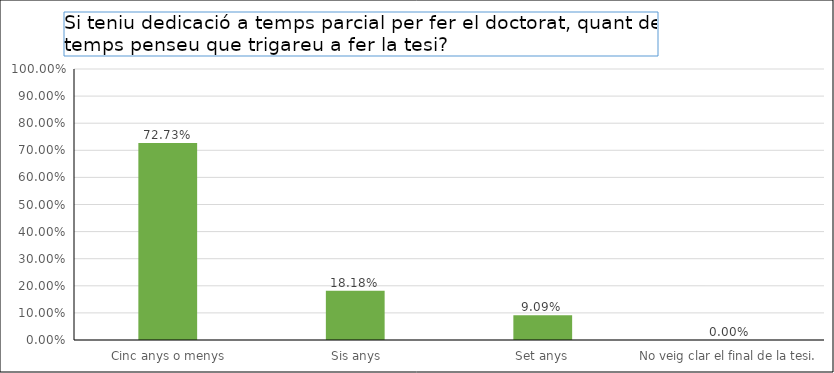
| Category | Series 0 |
|---|---|
|  Cinc anys o menys | 0.727 |
|  Sis anys | 0.182 |
| Set anys | 0.091 |
| No veig clar el final de la tesi. | 0 |